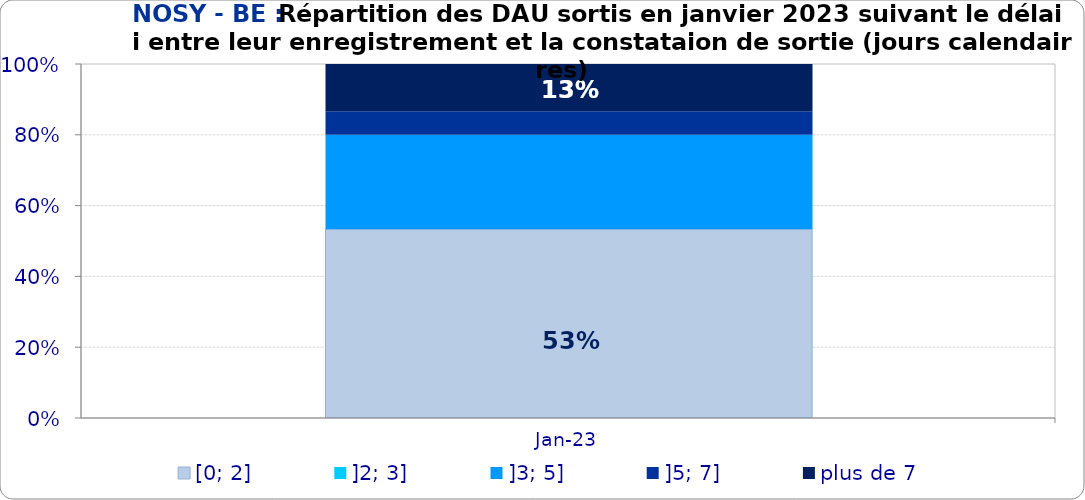
| Category | [0; 2] | ]2; 3] | ]3; 5] | ]5; 7] | plus de 7 |
|---|---|---|---|---|---|
| 2023-01-01 | 0.533 | 0 | 0.267 | 0.067 | 0.133 |